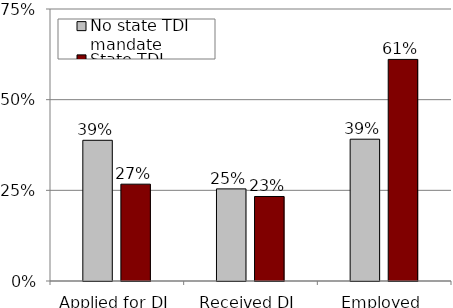
| Category | No state TDI mandate | State TDI mandate |
|---|---|---|
| Applied for DI | 0.388 | 0.267 |
| Received DI | 0.254 | 0.233 |
| Employed | 0.391 | 0.611 |